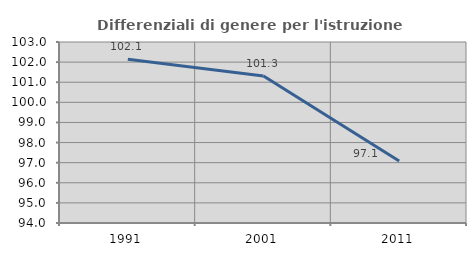
| Category | Differenziali di genere per l'istruzione superiore |
|---|---|
| 1991.0 | 102.141 |
| 2001.0 | 101.305 |
| 2011.0 | 97.084 |